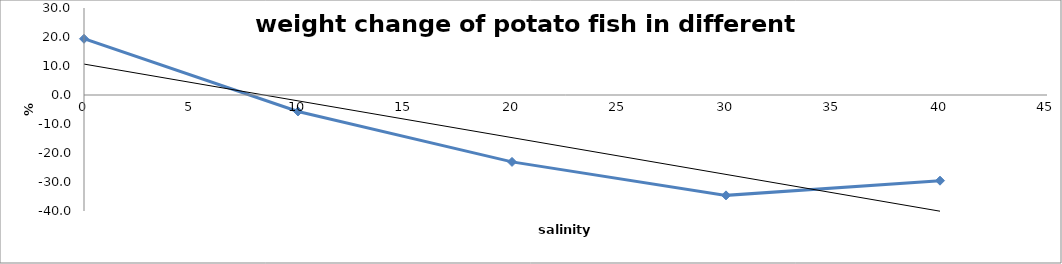
| Category | % change |
|---|---|
| 0.0 | 19.394 |
| 10.0 | -5.669 |
| 20.0 | -23.066 |
| 30.0 | -34.61 |
| 40.0 | -29.553 |